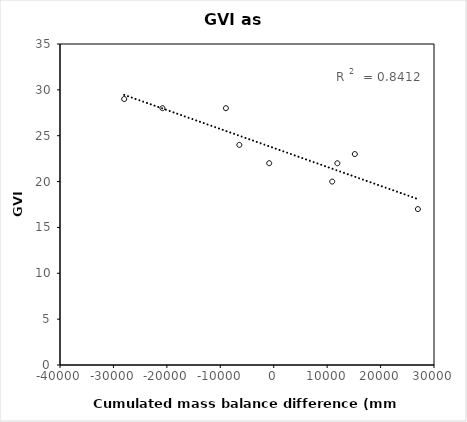
| Category | Series 0 |
|---|---|
| nan | 24 |
| nan | 19 |
| -844.0 | 22 |
| 26988.5 | 17 |
| nan | 29 |
| nan | 19 |
| 10950.5 | 20 |
| 11912.375 | 22 |
| nan | 29 |
| nan | 21 |
| nan | 26 |
| nan | 20 |
| nan | 18 |
| nan | 23 |
| nan | 17 |
| -8947.375 | 28 |
| -27983.5 | 29 |
| nan | 21 |
| nan | 22 |
| -20825.125 | 28 |
| nan | 26 |
| nan | 25 |
| nan | 21 |
| nan | 20 |
| nan | 21 |
| nan | 20 |
| nan | 29 |
| nan | 22 |
| nan | 23 |
| nan | 27 |
| nan | 20 |
| nan | 22 |
| nan | 19 |
| nan | 22 |
| nan | 20 |
| nan | 17 |
| -6430.75 | 24 |
| nan | 23 |
| nan | 28 |
| nan | 27 |
| nan | 20 |
| nan | 25 |
| nan | 23 |
| nan | 24 |
| nan | 24 |
| 15179.375 | 23 |